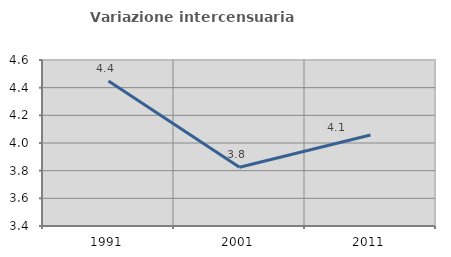
| Category | Variazione intercensuaria annua |
|---|---|
| 1991.0 | 4.448 |
| 2001.0 | 3.825 |
| 2011.0 | 4.058 |